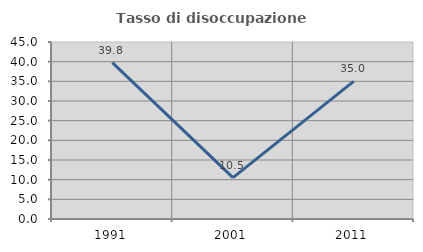
| Category | Tasso di disoccupazione giovanile  |
|---|---|
| 1991.0 | 39.773 |
| 2001.0 | 10.526 |
| 2011.0 | 35 |